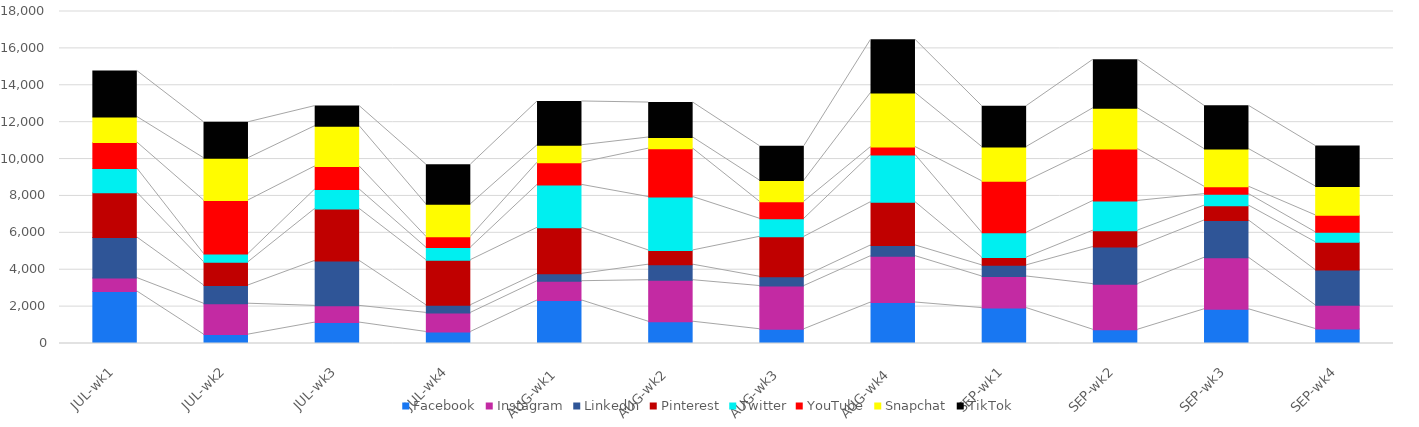
| Category | Facebook | Instagram | LinkedIn | Pinterest | Twitter | YouTube | Snapchat | TikTok |
|---|---|---|---|---|---|---|---|---|
| JUL-wk1 | 2823 | 724 | 2202 | 2428 | 1313 | 1409 | 1383 | 2489 |
| JUL-wk2 | 482 | 1675 | 991 | 1263 | 446 | 2898 | 2292 | 1947 |
| JUL-wk3 | 1134 | 906 | 2438 | 2820 | 1053 | 1249 | 2184 | 1087 |
| JUL-wk4 | 626 | 1034 | 415 | 2444 | 681 | 589 | 1759 | 2149 |
| AUG-wk1 | 2334 | 1044 | 400 | 2496 | 2326 | 1204 | 944 | 2374 |
| AUG-wk2 | 1181 | 2251 | 841 | 773 | 2896 | 2621 | 606 | 1894 |
| AUG-wk3 | 774 | 2342 | 503 | 2165 | 981 | 923 | 1149 | 1864 |
| AUG-wk4 | 2223 | 2513 | 583 | 2345 | 2561 | 427 | 2932 | 2883 |
| SEP-wk1 | 1921 | 1713 | 604 | 421 | 1344 | 2792 | 1861 | 2212 |
| SEP-wk2 | 744 | 2475 | 2014 | 886 | 1610 | 2815 | 2213 | 2627 |
| SEP-wk3 | 1856 | 2792 | 2022 | 804 | 624 | 401 | 2042 | 2343 |
| SEP-wk4 | 787 | 1284 | 1910 | 1512 | 539 | 916 | 1569 | 2191 |